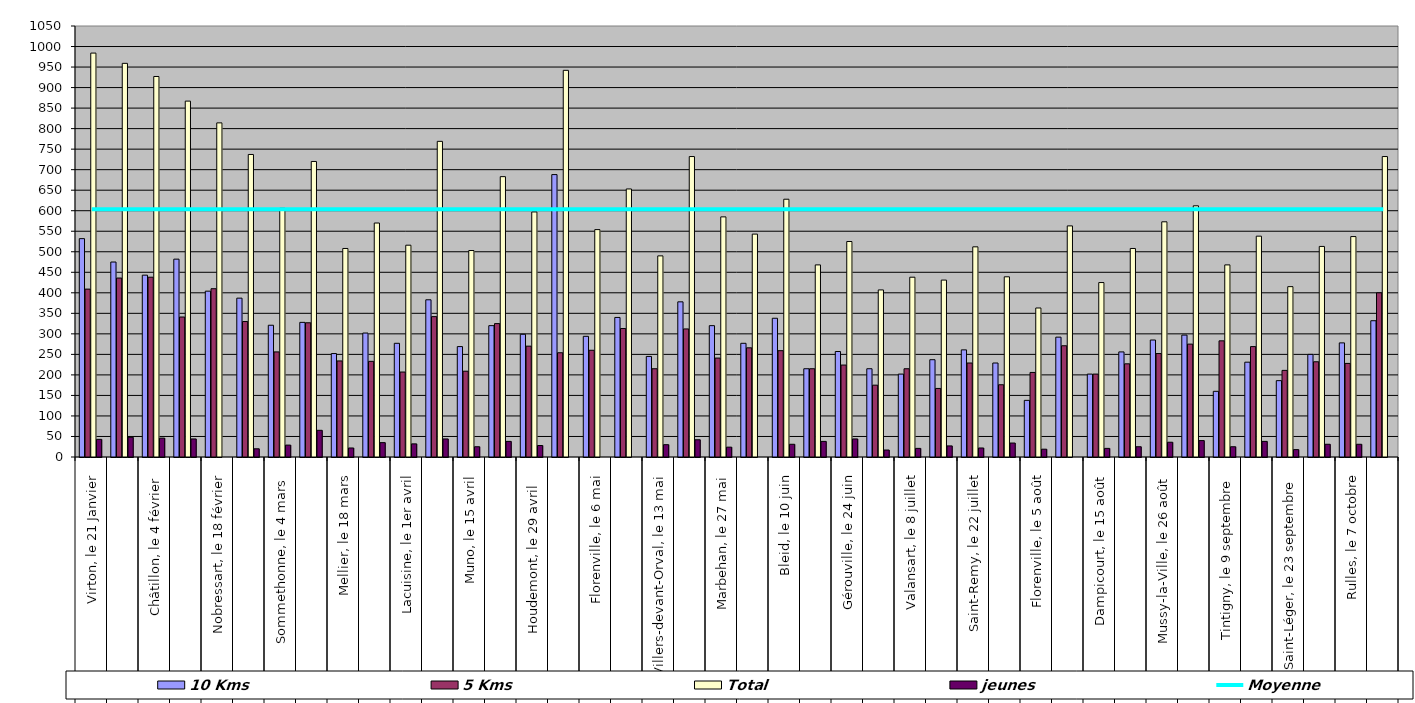
| Category | 10 Kms | 5 Kms | Total | jeunes |
|---|---|---|---|---|
| 0 | 532 | 409 | 984 | 43 |
| 1 | 475 | 436 | 959 | 48 |
| 2 | 443 | 438 | 927 | 46 |
| 3 | 482 | 341 | 867 | 44 |
| 4 | 404 | 410 | 814 | 0 |
| 5 | 387 | 330 | 737 | 20 |
| 6 | 321 | 256 | 606 | 29 |
| 7 | 328 | 327 | 720 | 65 |
| 8 | 252 | 234 | 508 | 22 |
| 9 | 302 | 233 | 570 | 35 |
| 10 | 277 | 207 | 516 | 32 |
| 11 | 383 | 342 | 769 | 44 |
| 12 | 269 | 209 | 503 | 25 |
| 13 | 320 | 325 | 683 | 38 |
| 14 | 299 | 270 | 597 | 28 |
| 15 | 688 | 254 | 942 | 0 |
| 16 | 294 | 260 | 554 | 0 |
| 17 | 340 | 313 | 653 | 0 |
| 18 | 245 | 215 | 490 | 30 |
| 19 | 378 | 312 | 732 | 42 |
| 20 | 320 | 241 | 585 | 24 |
| 21 | 277 | 266 | 543 | 0 |
| 22 | 338 | 259 | 628 | 31 |
| 23 | 215 | 215 | 468 | 38 |
| 24 | 257 | 224 | 525 | 44 |
| 25 | 215 | 175 | 407 | 17 |
| 26 | 202 | 215 | 438 | 21 |
| 27 | 237 | 167 | 431 | 27 |
| 28 | 261 | 229 | 512 | 22 |
| 29 | 229 | 176 | 439 | 34 |
| 30 | 138 | 206 | 363 | 19 |
| 31 | 292 | 271 | 563 | 0 |
| 32 | 202 | 202 | 425 | 21 |
| 33 | 256 | 227 | 508 | 25 |
| 34 | 285 | 252 | 573 | 36 |
| 35 | 297 | 275 | 612 | 40 |
| 36 | 160 | 283 | 468 | 25 |
| 37 | 231 | 269 | 538 | 38 |
| 38 | 186 | 211 | 415 | 18 |
| 39 | 250 | 232 | 513 | 31 |
| 40 | 278 | 228 | 537 | 31 |
| 41 | 332 | 400 | 732 | 0 |